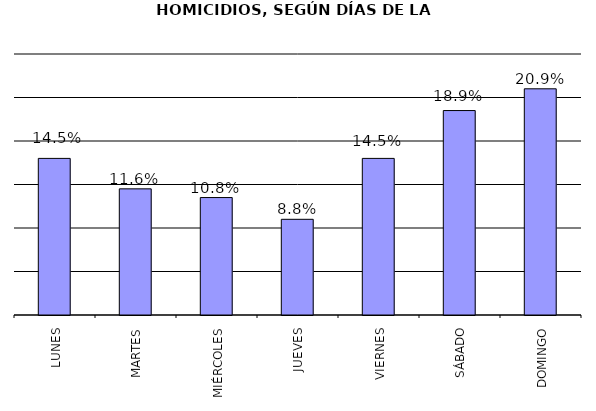
| Category | Series 0 |
|---|---|
| LUNES | 36 |
| MARTES | 29 |
| MIÉRCOLES | 27 |
| JUEVES | 22 |
| VIERNES | 36 |
| SÁBADO | 47 |
| DOMINGO | 52 |